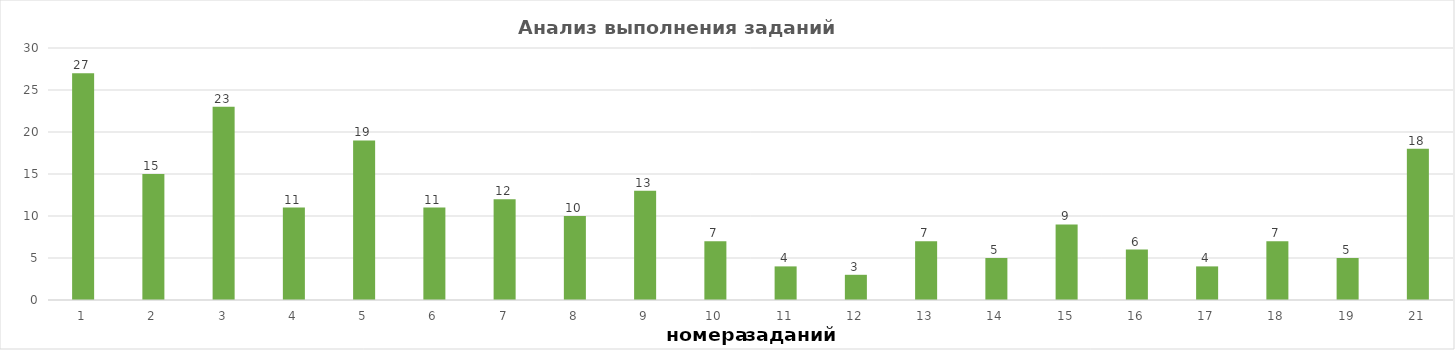
| Category | задания |
|---|---|
| 1.0 | 27 |
| 2.0 | 15 |
| 3.0 | 23 |
| 4.0 | 11 |
| 5.0 | 19 |
| 6.0 | 11 |
| 7.0 | 12 |
| 8.0 | 10 |
| 9.0 | 13 |
| 10.0 | 7 |
| 11.0 | 4 |
| 12.0 | 3 |
| 13.0 | 7 |
| 14.0 | 5 |
| 15.0 | 9 |
| 16.0 | 6 |
| 17.0 | 4 |
| 18.0 | 7 |
| 19.0 | 5 |
| 21.0 | 18 |